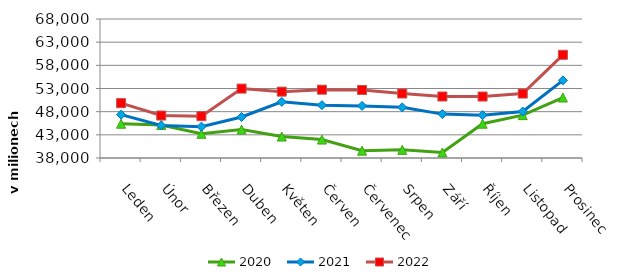
| Category | 2020 | 2021 | 2022 |
|---|---|---|---|
| Leden | 45393.051 | 47356.114 | 49842.271 |
| Únor | 45129.78 | 45036.142 | 47163.482 |
| Březen | 43222.779 | 44769.404 | 47027.101 |
| Duben  | 44135.674 | 46859.485 | 52977.569 |
| Květen | 42636 | 50125.315 | 52323.978 |
| Červen | 41982.067 | 49404.932 | 52744.155 |
| Červenec | 39583.617 | 49248.499 | 52682.845 |
| Srpen | 39758.377 | 48927.934 | 51920.038 |
| Září | 39196.819 | 47470.49 | 51271.531 |
| Říjen | 45394.994 | 47249.297 | 51263.747 |
| Listopad | 47251.866 | 48034.567 | 51904.924 |
| Prosinec | 51053.874 | 54750.412 | 60271.74 |